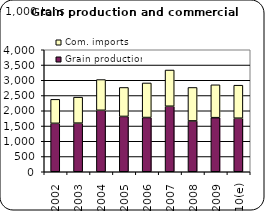
| Category | Grain production | Com. imports |
|---|---|---|
| 2002 | 1588.004 | 786.06 |
| 2003 | 1593.891 | 851.848 |
| 2004 | 2015.022 | 1007.809 |
| 2005 | 1814.107 | 950.225 |
| 2006 | 1777.708 | 1134.033 |
| 2007 | 2148.405 | 1187.526 |
| 2008 | 1666.997 | 1097.043 |
| 2009 | 1773.258 | 1078 |
| 2010(e) | 1756 | 1082.588 |